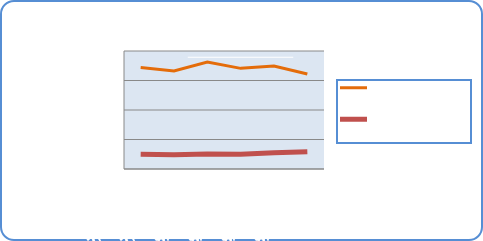
| Category | Motorin Türleri  | Benzin Türleri |
|---|---|---|
| 7/30/18 | 68864190.283 | 9983664.729 |
| 7/31/18 | 66520654.102 | 9581978.567 |
| 8/1/18 | 72512315.886 | 10122966.854 |
| 8/2/18 | 68237834.361 | 9947414.915 |
| 8/3/18 | 69803281.15 | 11010606.507 |
| 8/4/18 | 64404678.145 | 11654744.772 |